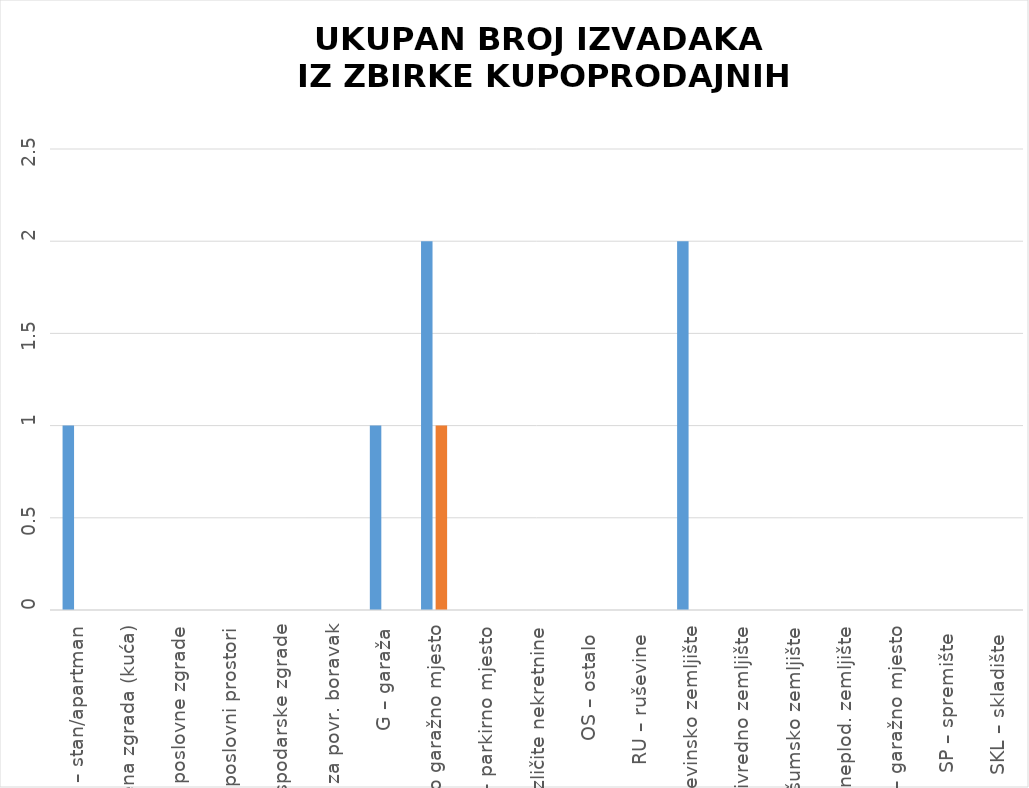
| Category | BROJ IZDANIH IZVADAKA - Zahtjev predan u eNekretninama | BROJ IZDANIH IZVADAKA -  
Zahtjev predan osobno |
|---|---|---|
| ST – stan/apartman | 1 | 0 |
| OK – stambena zgrada (kuća) | 0 | 0 |
| PZG – poslovne zgrade | 0 | 0 |
| PP – poslovni prostori | 0 | 0 |
| GZG – gospodarske zgrade | 0 | 0 |
| VIK – nekretn. za povr. boravak | 0 | 0 |
| G – garaža | 1 | 0 |
| PGM – parkirno garažno mjesto | 2 | 1 |
| VPM – parkirno mjesto | 0 | 0 |
| RN – različite nekretnine | 0 | 0 |
| OS – ostalo  | 0 | 0 |
| RU – ruševine  | 0 | 0 |
| GZ – građevinsko zemljište | 2 | 0 |
| PZ – poljoprivredno zemljište | 0 | 0 |
| ŠZ – šumsko zemljište | 0 | 0 |
| PNZ – prirodno neplod. zemljište | 0 | 0 |
| GM – garažno mjesto | 0 | 0 |
| SP – spremište  | 0 | 0 |
| SKL – skladište  | 0 | 0 |